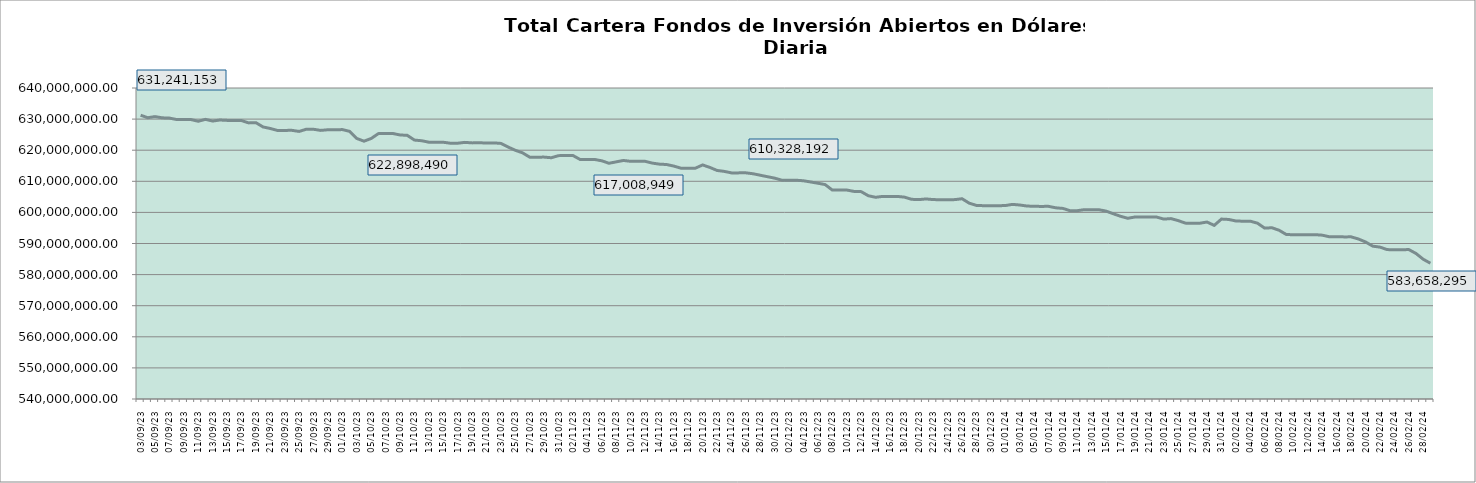
| Category | Cartera |
|---|---|
| 2023-09-03 | 631241152.77 |
| 2023-09-04 | 630445632.35 |
| 2023-09-05 | 630803968.53 |
| 2023-09-06 | 630410162.07 |
| 2023-09-07 | 630328776.06 |
| 2023-09-08 | 629862871.91 |
| 2023-09-09 | 629834149.98 |
| 2023-09-10 | 629848710.38 |
| 2023-09-11 | 629302022.2 |
| 2023-09-12 | 629921438.88 |
| 2023-09-13 | 629369255.47 |
| 2023-09-14 | 629706943.49 |
| 2023-09-15 | 629586356.93 |
| 2023-09-16 | 629530597.95 |
| 2023-09-17 | 629546459.53 |
| 2023-09-18 | 628779780.99 |
| 2023-09-19 | 628861511.4 |
| 2023-09-20 | 627472168.54 |
| 2023-09-21 | 626981471.57 |
| 2023-09-22 | 626343530.21 |
| 2023-09-23 | 626365716.65 |
| 2023-09-24 | 626387077.26 |
| 2023-09-25 | 626035802.99 |
| 2023-09-26 | 626746486.02 |
| 2023-09-27 | 626727082.97 |
| 2023-09-28 | 626364911.59 |
| 2023-09-29 | 626577853.12 |
| 2023-09-30 | 626558294.54 |
| 2023-10-01 | 626630181.41 |
| 2023-10-02 | 626064064 |
| 2023-10-03 | 623776833.22 |
| 2023-10-04 | 622898490.48 |
| 2023-10-05 | 623765057.16 |
| 2023-10-06 | 625329398.49 |
| 2023-10-07 | 625357716.82 |
| 2023-10-08 | 625377076.92 |
| 2023-10-09 | 624895198.31 |
| 2023-10-10 | 624784848.21 |
| 2023-10-11 | 623258734.78 |
| 2023-10-12 | 623043383.61 |
| 2023-10-13 | 622575019.93 |
| 2023-10-14 | 622552964.89 |
| 2023-10-15 | 622558015.47 |
| 2023-10-16 | 622241454.37 |
| 2023-10-17 | 622245757.4 |
| 2023-10-18 | 622516652.22 |
| 2023-10-19 | 622353387.79 |
| 2023-10-20 | 622367994.78 |
| 2023-10-21 | 622338417.91 |
| 2023-10-22 | 622354218.29 |
| 2023-10-23 | 622185803.88 |
| 2023-10-24 | 621022062.92 |
| 2023-10-25 | 619977031.74 |
| 2023-10-26 | 619157040.59 |
| 2023-10-27 | 617769457.82 |
| 2023-10-28 | 617759539.98 |
| 2023-10-29 | 617777286.33 |
| 2023-10-30 | 617575557.56 |
| 2023-10-31 | 618250862.96 |
| 2023-11-01 | 618284254.62 |
| 2023-11-02 | 618295975.38 |
| 2023-11-03 | 617008948.58 |
| 2023-11-04 | 617012402.6 |
| 2023-11-05 | 617026032.4 |
| 2023-11-06 | 616588553.22 |
| 2023-11-07 | 615802234.9 |
| 2023-11-08 | 616245770.29 |
| 2023-11-09 | 616699385.57 |
| 2023-11-10 | 616428658.15 |
| 2023-11-11 | 616427509.43 |
| 2023-11-12 | 616441646.85 |
| 2023-11-13 | 615857000.56 |
| 2023-11-14 | 615518268.35 |
| 2023-11-15 | 615394438.58 |
| 2023-11-16 | 614891335.14 |
| 2023-11-17 | 614211343.69 |
| 2023-11-18 | 614213053.27 |
| 2023-11-19 | 614226265.49 |
| 2023-11-20 | 615260963.47 |
| 2023-11-21 | 614465100.72 |
| 2023-11-22 | 613490454.91 |
| 2023-11-23 | 613190306.71 |
| 2023-11-24 | 612707460.65 |
| 2023-11-25 | 612707964.31 |
| 2023-11-26 | 612721200.3 |
| 2023-11-27 | 612428100.64 |
| 2023-11-28 | 611950558.76 |
| 2023-11-29 | 611473435 |
| 2023-11-30 | 611009715.37 |
| 2023-12-01 | 610356615.3 |
| 2023-12-02 | 610328191.85 |
| 2023-12-03 | 610341715.72 |
| 2023-12-04 | 610172868.69 |
| 2023-12-05 | 609778742.97 |
| 2023-12-06 | 609380953.2 |
| 2023-12-07 | 608948882.46 |
| 2023-12-08 | 607178127.02 |
| 2023-12-09 | 607172032.52 |
| 2023-12-10 | 607193159.91 |
| 2023-12-11 | 606752180.93 |
| 2023-12-12 | 606678647.58 |
| 2023-12-13 | 605353047 |
| 2023-12-14 | 604857795.12 |
| 2023-12-15 | 605150551.68 |
| 2023-12-16 | 605131400.01 |
| 2023-12-17 | 605144731.96 |
| 2023-12-18 | 604908731.46 |
| 2023-12-19 | 604210080.8 |
| 2023-12-20 | 604109124.09 |
| 2023-12-21 | 604329531.01 |
| 2023-12-22 | 604116944.42 |
| 2023-12-23 | 604086319.41 |
| 2023-12-24 | 604094910.42 |
| 2023-12-25 | 604108041.63 |
| 2023-12-26 | 604396445.91 |
| 2023-12-27 | 602964873.52 |
| 2023-12-28 | 602248257.48 |
| 2023-12-29 | 602157295.01 |
| 2023-12-30 | 602137635.44 |
| 2023-12-31 | 602151330.27 |
| 2024-01-01 | 602201218.43 |
| 2024-01-02 | 602576952.32 |
| 2024-01-03 | 602381474.31 |
| 2024-01-04 | 602054617.98 |
| 2024-01-05 | 601947526.69 |
| 2024-01-06 | 601931607.8 |
| 2024-01-07 | 601944489.44 |
| 2024-01-08 | 601478248.59 |
| 2024-01-09 | 601282812.84 |
| 2024-01-10 | 600544837.33 |
| 2024-01-11 | 600557204.7 |
| 2024-01-12 | 600889570.58 |
| 2024-01-13 | 600845763.55 |
| 2024-01-14 | 600856275.91 |
| 2024-01-15 | 600409267.35 |
| 2024-01-16 | 599557557.91 |
| 2024-01-17 | 598747952.33 |
| 2024-01-18 | 598112799.15 |
| 2024-01-19 | 598520577.48 |
| 2024-01-20 | 598485353.47 |
| 2024-01-21 | 598495072.73 |
| 2024-01-22 | 598505218.44 |
| 2024-01-23 | 597842377.3 |
| 2024-01-24 | 598008339.17 |
| 2024-01-25 | 597360845.29 |
| 2024-01-26 | 596550990.07 |
| 2024-01-27 | 596519863.94 |
| 2024-01-28 | 596526824.75 |
| 2024-01-29 | 596899548.22 |
| 2024-01-30 | 595823189.54 |
| 2024-01-31 | 597855603.72 |
| 2024-02-01 | 597733884.27 |
| 2024-02-02 | 597245582.79 |
| 2024-02-03 | 597165584.22 |
| 2024-02-04 | 597173556.31 |
| 2024-02-05 | 596532490.04 |
| 2024-02-06 | 594946523.77 |
| 2024-02-07 | 595067399.53 |
| 2024-02-08 | 594259657.69 |
| 2024-02-09 | 592893755.62 |
| 2024-02-10 | 592813964.87 |
| 2024-02-11 | 592821335.8 |
| 2024-02-12 | 592835892.67 |
| 2024-02-13 | 592842640.21 |
| 2024-02-14 | 592675609.25 |
| 2024-02-15 | 592153527.49 |
| 2024-02-16 | 592200435.64 |
| 2024-02-17 | 592126189.97 |
| 2024-02-18 | 592132950.28 |
| 2024-02-19 | 591457927.36 |
| 2024-02-20 | 590495381.45 |
| 2024-02-21 | 589148246.44 |
| 2024-02-22 | 588834851.48 |
| 2024-02-23 | 588040997.21 |
| 2024-02-24 | 587978615.04 |
| 2024-02-25 | 587983994.65 |
| 2024-02-26 | 588055978.83 |
| 2024-02-27 | 586793647.33 |
| 2024-02-28 | 584940636.42 |
| 2024-02-29 | 583658294.76 |